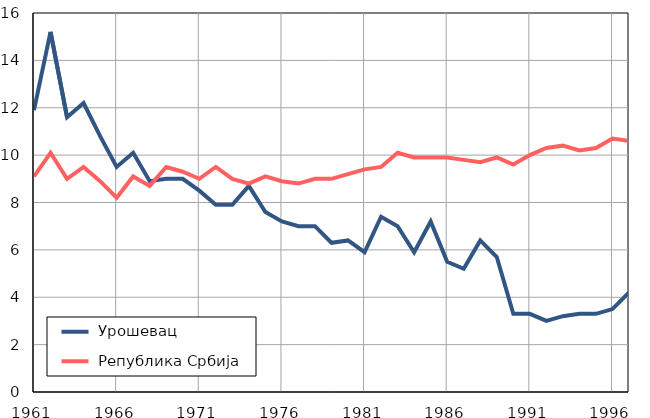
| Category |  Урошевац |  Република Србија |
|---|---|---|
| 1961.0 | 11.9 | 9.1 |
| 1962.0 | 15.2 | 10.1 |
| 1963.0 | 11.6 | 9 |
| 1964.0 | 12.2 | 9.5 |
| 1965.0 | 10.8 | 8.9 |
| 1966.0 | 9.5 | 8.2 |
| 1967.0 | 10.1 | 9.1 |
| 1968.0 | 8.9 | 8.7 |
| 1969.0 | 9 | 9.5 |
| 1970.0 | 9 | 9.3 |
| 1971.0 | 8.5 | 9 |
| 1972.0 | 7.9 | 9.5 |
| 1973.0 | 7.9 | 9 |
| 1974.0 | 8.7 | 8.8 |
| 1975.0 | 7.6 | 9.1 |
| 1976.0 | 7.2 | 8.9 |
| 1977.0 | 7 | 8.8 |
| 1978.0 | 7 | 9 |
| 1979.0 | 6.3 | 9 |
| 1980.0 | 6.4 | 9.2 |
| 1981.0 | 5.9 | 9.4 |
| 1982.0 | 7.4 | 9.5 |
| 1983.0 | 7 | 10.1 |
| 1984.0 | 5.9 | 9.9 |
| 1985.0 | 7.2 | 9.9 |
| 1986.0 | 5.5 | 9.9 |
| 1987.0 | 5.2 | 9.8 |
| 1988.0 | 6.4 | 9.7 |
| 1989.0 | 5.7 | 9.9 |
| 1990.0 | 3.3 | 9.6 |
| 1991.0 | 3.3 | 10 |
| 1992.0 | 3 | 10.3 |
| 1993.0 | 3.2 | 10.4 |
| 1994.0 | 3.3 | 10.2 |
| 1995.0 | 3.3 | 10.3 |
| 1996.0 | 3.5 | 10.7 |
| 1997.0 | 4.2 | 10.6 |